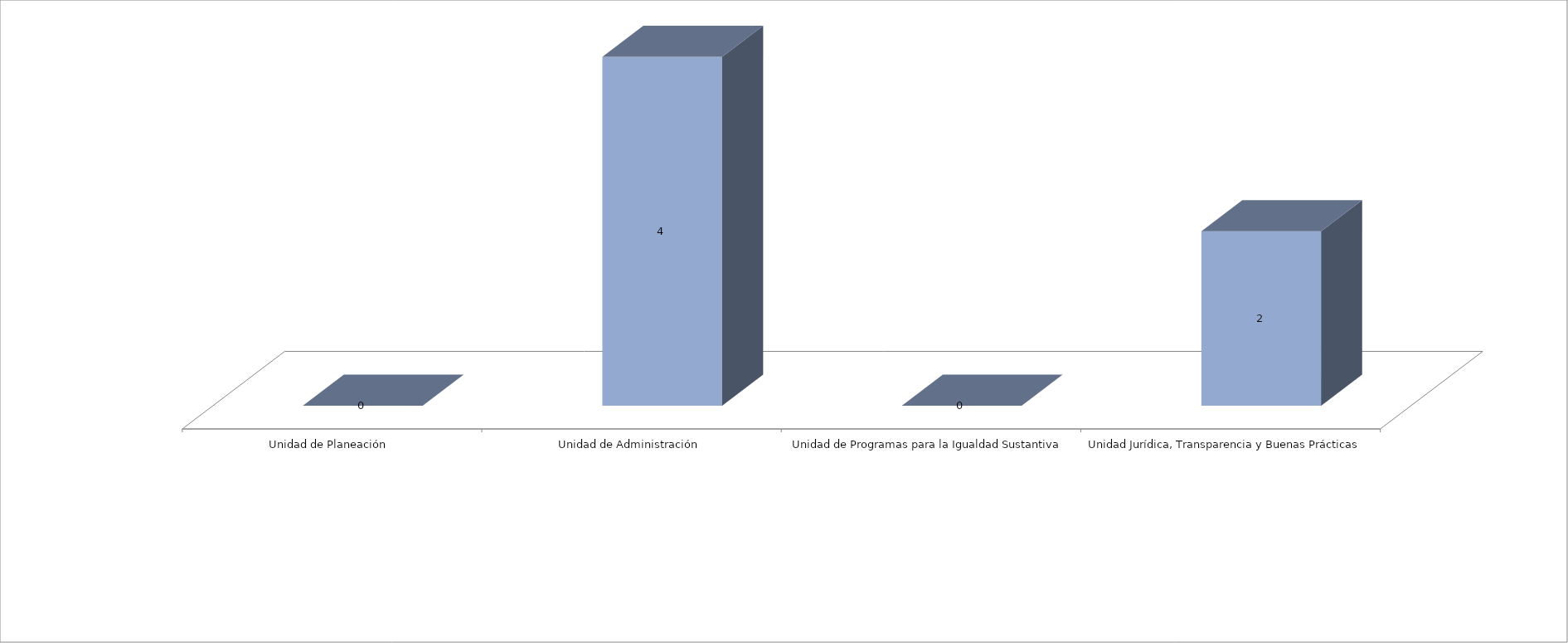
| Category | Series 0 | Series 1 |
|---|---|---|
| Unidad de Planeación  |  | 0 |
| Unidad de Administración |  | 4 |
| Unidad de Programas para la Igualdad Sustantiva |  | 0 |
| Unidad Jurídica, Transparencia y Buenas Prácticas  |  | 2 |